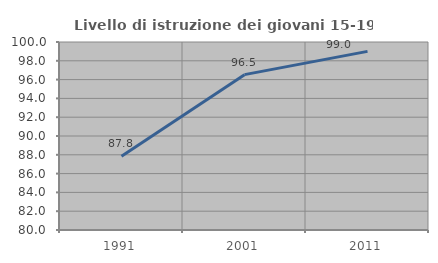
| Category | Livello di istruzione dei giovani 15-19 anni |
|---|---|
| 1991.0 | 87.838 |
| 2001.0 | 96.528 |
| 2011.0 | 99.004 |